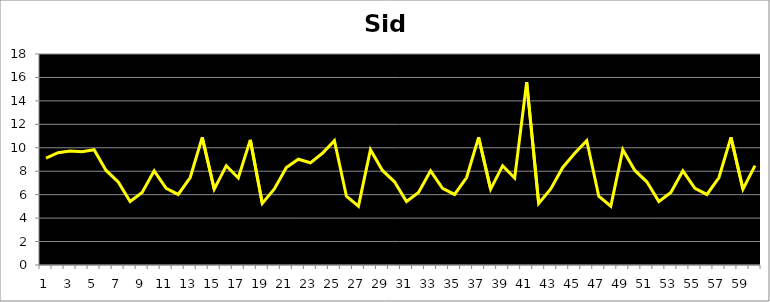
| Category | Sid |
|---|---|
| 0 | 9.112 |
| 1 | 9.582 |
| 2 | 9.734 |
| 3 | 9.655 |
| 4 | 9.84 |
| 5 | 8.066 |
| 6 | 7.099 |
| 7 | 5.417 |
| 8 | 6.193 |
| 9 | 8.037 |
| 10 | 6.54 |
| 11 | 6.018 |
| 12 | 7.462 |
| 13 | 10.888 |
| 14 | 6.469 |
| 15 | 8.474 |
| 16 | 7.427 |
| 17 | 10.676 |
| 18 | 5.253 |
| 19 | 6.486 |
| 20 | 8.319 |
| 21 | 9.023 |
| 22 | 8.718 |
| 23 | 9.53 |
| 24 | 10.608 |
| 25 | 5.869 |
| 26 | 5.018 |
| 27 | 9.84 |
| 28 | 8.066 |
| 29 | 7.099 |
| 30 | 5.417 |
| 31 | 6.193 |
| 32 | 8.037 |
| 33 | 6.54 |
| 34 | 6.018 |
| 35 | 7.462 |
| 36 | 10.888 |
| 37 | 6.469 |
| 38 | 8.474 |
| 39 | 7.427 |
| 40 | 15.598 |
| 41 | 5.253 |
| 42 | 6.486 |
| 43 | 8.319 |
| 44 | 9.53 |
| 45 | 10.608 |
| 46 | 5.869 |
| 47 | 5.018 |
| 48 | 9.84 |
| 49 | 8.066 |
| 50 | 7.099 |
| 51 | 5.417 |
| 52 | 6.193 |
| 53 | 8.037 |
| 54 | 6.54 |
| 55 | 6.018 |
| 56 | 7.462 |
| 57 | 10.888 |
| 58 | 6.469 |
| 59 | 8.474 |